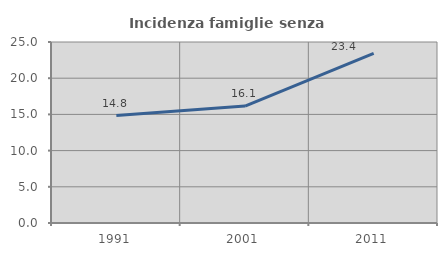
| Category | Incidenza famiglie senza nuclei |
|---|---|
| 1991.0 | 14.843 |
| 2001.0 | 16.144 |
| 2011.0 | 23.42 |